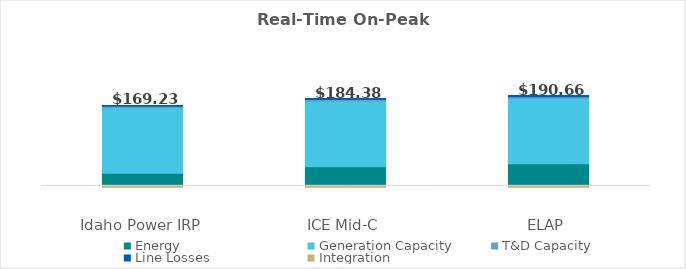
| Category | Energy | Generation Capacity | T&D Capacity | Line Losses | Integration |
|---|---|---|---|---|---|
| 0 | 26.835 | 140.334 | 3.437 | 1.556 | -2.93 |
| 1 | 41.151 | 140.334 | 3.437 | 2.387 | -2.93 |
| 2 | 47.088 | 140.334 | 3.437 | 2.731 | -2.93 |